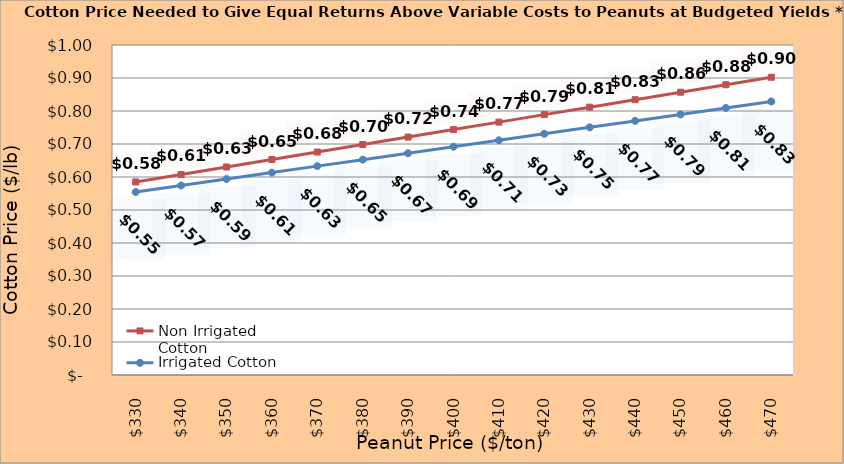
| Category | Non Irrigated Cotton | Irrigated Cotton |
|---|---|---|
| 330.0 | 0.585 | 0.555 |
| 340.0 | 0.608 | 0.574 |
| 350.0 | 0.63 | 0.594 |
| 360.0 | 0.653 | 0.613 |
| 370.0 | 0.676 | 0.633 |
| 380.0 | 0.698 | 0.653 |
| 390.0 | 0.721 | 0.672 |
| 400.0 | 0.744 | 0.692 |
| 410.0 | 0.766 | 0.711 |
| 420.0 | 0.789 | 0.731 |
| 430.0 | 0.812 | 0.75 |
| 440.0 | 0.834 | 0.77 |
| 450.0 | 0.857 | 0.79 |
| 460.0 | 0.88 | 0.809 |
| 470.0 | 0.902 | 0.829 |